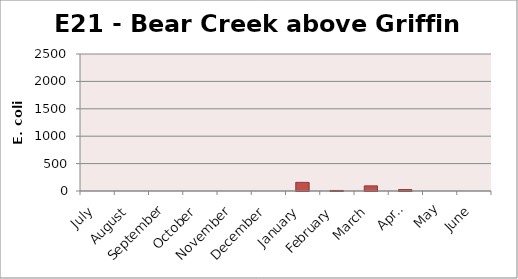
| Category | E. coli MPN |
|---|---|
| July | 0 |
| August | 0 |
| September | 0 |
| October | 0 |
| November | 0 |
| December | 0 |
| January | 157.6 |
| February | 9.8 |
| March | 93.3 |
| April | 25.9 |
| May | 0 |
| June | 0 |